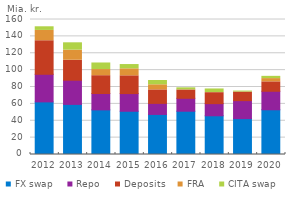
| Category | FX swap | Repo | Deposits | FRA | CITA swap |
|---|---|---|---|---|---|
| 2012.0 | 62357.546 | 32722.224 | 39741.968 | 12224.561 | 4319.584 |
| 2013.0 | 59387.17 | 28660.563 | 23680.321 | 11933.017 | 8715.407 |
| 2014.0 | 52894.454 | 19373.273 | 21154.654 | 7258.67 | 7787.28 |
| 2015.0 | 51251.172 | 20949.93 | 21067.053 | 8273.079 | 5070.713 |
| 2016.0 | 47490.369 | 13098.002 | 16001.713 | 6022.047 | 5076.231 |
| 2017.0 | 51292.779 | 15321.847 | 9867.793 | 135.314 | 2402.036 |
| 2018.0 | 45882.288 | 14397.763 | 13005.318 | 104 | 4287.565 |
| 2019.0 | 42517.574 | 21332.789 | 10170.093 | 6.897 | 1146.848 |
| 2020.0 | 53010.246 | 21933.238 | 11152.997 | 3863.878 | 2667.591 |